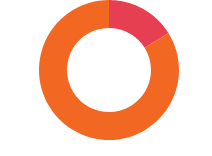
| Category | KÖTELEZETTSÉGEK |
|---|---|
| FEDEZETLEN | 3570000 |
| FEDEZETT | 18550000 |